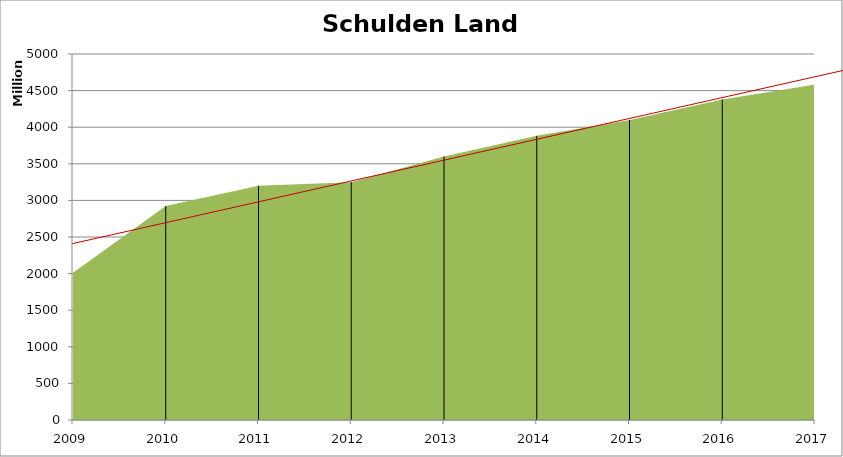
| Category | Schulden Land Stmk. |
|---|---|
| 2009.0 | 2010970000 |
| 2010.0 | 2922510000 |
| 2011.0 | 3198670000 |
| 2012.0 | 3249000000 |
| 2013.0 | 3601000000 |
| 2014.0 | 3882000000 |
| 2015.0 | 4099000000 |
| 2016.0 | 4379000000 |
| 2017.0 | 4582000000 |